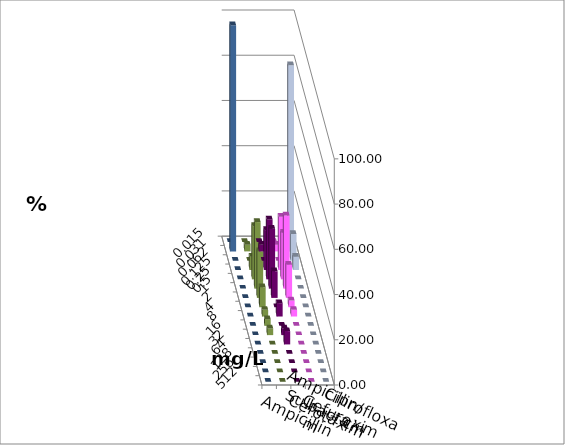
| Category | Ampicillin | Ampicillin/ Sulbactam | Cefotaxim | Cefuroxim | Ciprofloxacin |
|---|---|---|---|---|---|
| 0.015 | 0 | 0 | 0 | 0 | 0 |
| 0.031 | 2.941 | 2.941 | 82.353 | 2.941 | 100 |
| 0.062 | 0 | 0 | 11.765 | 0 | 0 |
| 0.125 | 17.647 | 23.529 | 5.882 | 5.882 | 0 |
| 0.25 | 26.471 | 20.588 | 0 | 23.529 | 0 |
| 0.5 | 26.471 | 32.353 | 0 | 29.412 | 0 |
| 1.0 | 11.765 | 14.706 | 0 | 20.588 | 0 |
| 2.0 | 0 | 2.941 | 0 | 8.824 | 0 |
| 4.0 | 5.882 | 2.941 | 0 | 2.941 | 0 |
| 8.0 | 0 | 0 | 0 | 2.941 | 0 |
| 16.0 | 2.941 | 0 | 0 | 2.941 | 0 |
| 32.0 | 5.882 | 0 | 0 | 0 | 0 |
| 64.0 | 0 | 0 | 0 | 0 | 0 |
| 128.0 | 0 | 0 | 0 | 0 | 0 |
| 256.0 | 0 | 0 | 0 | 0 | 0 |
| 512.0 | 0 | 0 | 0 | 0 | 0 |